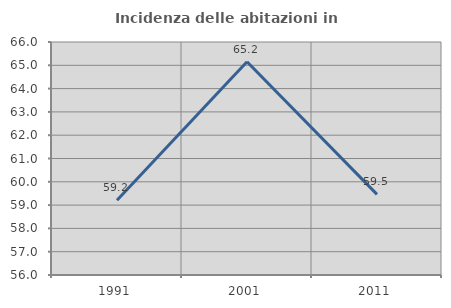
| Category | Incidenza delle abitazioni in proprietà  |
|---|---|
| 1991.0 | 59.211 |
| 2001.0 | 65.152 |
| 2011.0 | 59.459 |